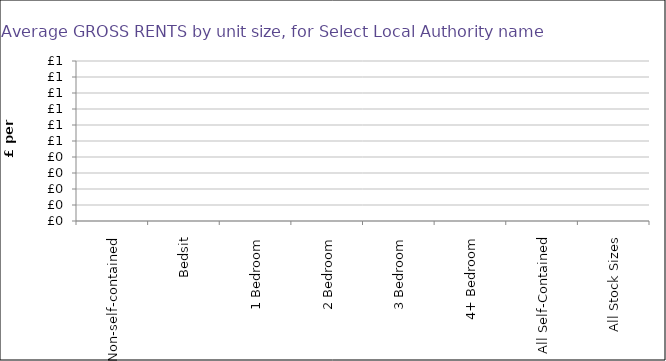
| Category | Gross |
|---|---|
| Non-self-contained | 0 |
| Bedsit | 0 |
| 1 Bedroom | 0 |
| 2 Bedroom | 0 |
| 3 Bedroom | 0 |
| 4+ Bedroom | 0 |
| All Self-Contained | 0 |
| All Stock Sizes | 0 |